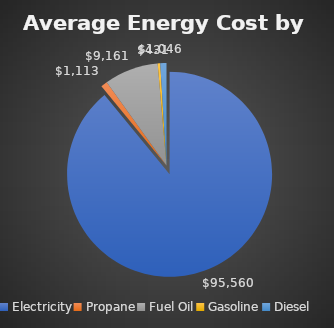
| Category | $95,560 |
|---|---|
| Electricity | 95559.659 |
| Propane | 1112.833 |
| Fuel Oil | 9161.213 |
| Gasoline | 431 |
| Diesel | 1046.18 |